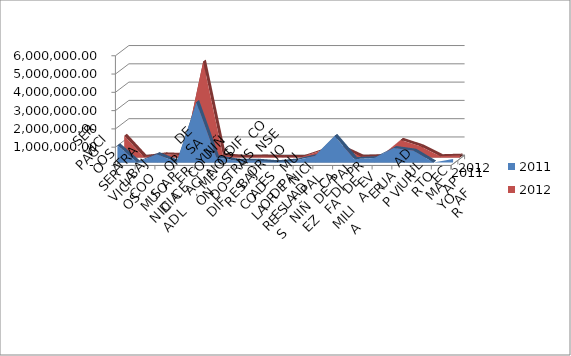
| Category | 2011 | 2012 |
|---|---|---|
| PAGO SERVICIOS | 942245.03 | 1186631.17 |
| SERVICIOS A LA COMUNIDAD | 0 | 24000 |
| TRABAJO SOCIAL | 458640.84 | 169800 |
| APCE | 15000 | 127500 |
| OPERACIÓN DIF | 3290898.51 | 5233400 |
| COMEDOR | 285732 | 120000 |
| DESAYUNOS ESCOLARES | 101815.68 | 18000 |
| NIÑOS TRABAJADORES | 101815.68 | 48000 |
| DIFUSORES DE LA NIÑEZ | 18000 | 18000 |
| PAAD | 113544 | 24000 |
| CONSEJO MUNICIPAL DE FAMILIA | 365280 | 380140.45 |
| CADI | 1450680 | 534330.82 |
| PAIDEA | 187644 | 32400 |
| PREVERP | 244724 | 71000 |
| UAVI | 794212.8 | 960997.56 |
| URR | 644522.64 | 607500 |
| ADULTO MAYOR | 0 | 68100 |
| ECAPAF | 202000 | 101000 |